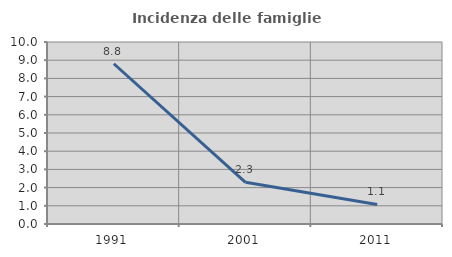
| Category | Incidenza delle famiglie numerose |
|---|---|
| 1991.0 | 8.805 |
| 2001.0 | 2.288 |
| 2011.0 | 1.075 |